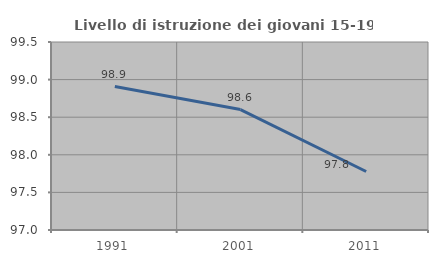
| Category | Livello di istruzione dei giovani 15-19 anni |
|---|---|
| 1991.0 | 98.907 |
| 2001.0 | 98.601 |
| 2011.0 | 97.778 |